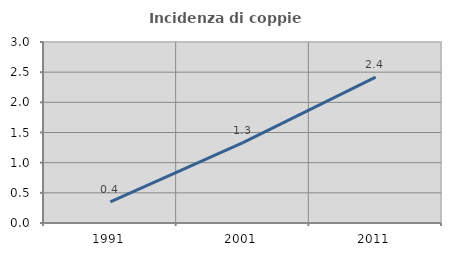
| Category | Incidenza di coppie miste |
|---|---|
| 1991.0 | 0.35 |
| 2001.0 | 1.333 |
| 2011.0 | 2.419 |